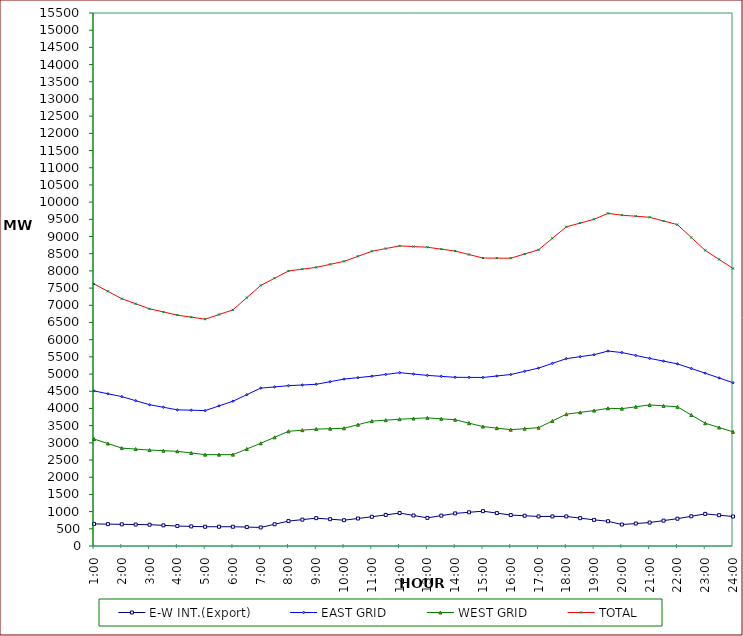
| Category | E-W INT.(Export) | EAST GRID | WEST GRID | TOTAL |
|---|---|---|---|---|
| 1:00 | 642 | 4510 | 3111 | 7621 |
| 1:30 | 636 | 4427 | 2979 | 7406 |
| 2:00 | 630 | 4344 | 2847 | 7191 |
| 2:30 | 625 | 4226 | 2818.5 | 7044.5 |
| 3:00 | 620 | 4108 | 2790 | 6898 |
| 3:30 | 600 | 4034 | 2772 | 6806 |
| 4:00 | 580 | 3960 | 2754 | 6714 |
| 4:30 | 570 | 3949 | 2705.5 | 6654.5 |
| 5:00 | 560 | 3938 | 2657 | 6595 |
| 5:30 | 560 | 4074 | 2657 | 6731 |
| 6:00 | 560 | 4210 | 2657 | 6867 |
| 6:30 | 550 | 4400.5 | 2821.5 | 7222 |
| 7:00 | 540 | 4591 | 2986 | 7577 |
| 7:30 | 632 | 4626.5 | 3161 | 7787.5 |
| 8:00 | 724 | 4662 | 3336 | 7998 |
| 8:30 | 767 | 4682.5 | 3368 | 8050.5 |
| 9:00 | 810 | 4703 | 3400 | 8103 |
| 9:30 | 780 | 4778.5 | 3411.5 | 8190 |
| 10:00 | 750 | 4854 | 3423 | 8277 |
| 10:30 | 800 | 4896 | 3527.5 | 8423.5 |
| 11:00 | 850 | 4938 | 3632 | 8570 |
| 11:30 | 904 | 4989.5 | 3659.5 | 8649 |
| 12:00 | 958 | 5041 | 3687 | 8728 |
| 12:30 | 888 | 5001 | 3707 | 8708 |
| 13:00 | 818 | 4961 | 3727 | 8688 |
| 13:30 | 883 | 4933.5 | 3699 | 8632.5 |
| 14:00 | 948 | 4906 | 3671 | 8577 |
| 14:30 | 980.5 | 4903.5 | 3572 | 8475.5 |
| 15:00 | 1013 | 4901 | 3473 | 8374 |
| 15:30 | 956.5 | 4944 | 3427.5 | 8371.5 |
| 16:00 | 900 | 4987 | 3382 | 8369 |
| 16:30 | 880 | 5080 | 3411.5 | 8491.5 |
| 17:00 | 860 | 5173 | 3441 | 8614 |
| 17:30 | 860 | 5310.5 | 3637 | 8947.5 |
| 18:00 | 860 | 5448 | 3833 | 9281 |
| 18:30 | 810 | 5505.5 | 3885.5 | 9391 |
| 19:00 | 760 | 5563 | 3938 | 9501 |
| 19:30 | 720 | 5669 | 4004 | 9673 |
| 20:00 | 624 | 5626 | 3994 | 9620 |
| 20:30 | 653 | 5541 | 4048.5 | 9589.5 |
| 21:00 | 682 | 5456 | 4103 | 9559 |
| 21:30 | 738 | 5376.5 | 4075.5 | 9452 |
| 22:00 | 794 | 5297 | 4048 | 9345 |
| 22:30 | 864 | 5161.5 | 3809.5 | 8971 |
| 23:00 | 934 | 5026 | 3571 | 8597 |
| 23:30 | 896 | 4887.5 | 3446 | 8333.5 |
| 24:00 | 858 | 4749 | 3321 | 8070 |